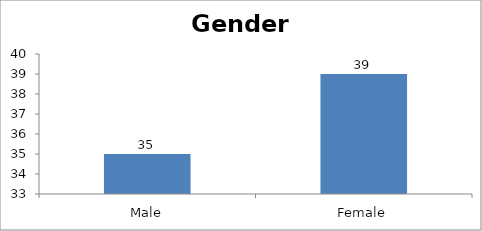
| Category | Gender |
|---|---|
| Male | 35 |
| Female | 39 |